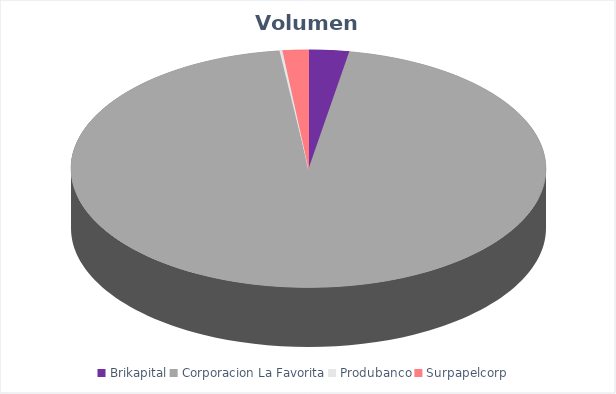
| Category | VOLUMEN ($USD) |
|---|---|
| Brikapital | 1000 |
| Corporacion La Favorita | 34789.69 |
| Produbanco | 72.45 |
| Surpapelcorp | 637.5 |